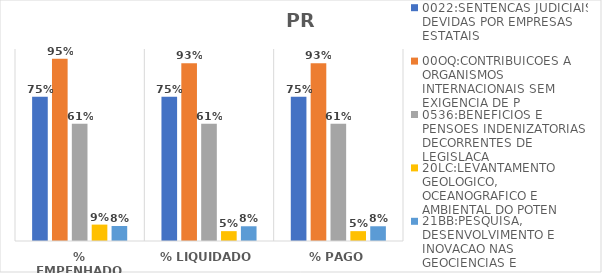
| Category | 0022:SENTENCAS JUDICIAIS DEVIDAS POR EMPRESAS ESTATAIS | 00OQ:CONTRIBUICOES A ORGANISMOS INTERNACIONAIS SEM EXIGENCIA DE P | 0536:BENEFICIOS E PENSOES INDENIZATORIAS DECORRENTES DE LEGISLACA | 20LC:LEVANTAMENTO GEOLOGICO, OCEANOGRAFICO E AMBIENTAL DO POTEN | 21BB:PESQUISA, DESENVOLVIMENTO E INOVACAO NAS GEOCIENCIAS E |
|---|---|---|---|---|---|
| % EMPENHADO | 0.751 | 0.95 | 0.611 | 0.085 | 0.078 |
| % LIQUIDADO | 0.751 | 0.926 | 0.611 | 0.051 | 0.077 |
| % PAGO | 0.751 | 0.926 | 0.611 | 0.051 | 0.077 |